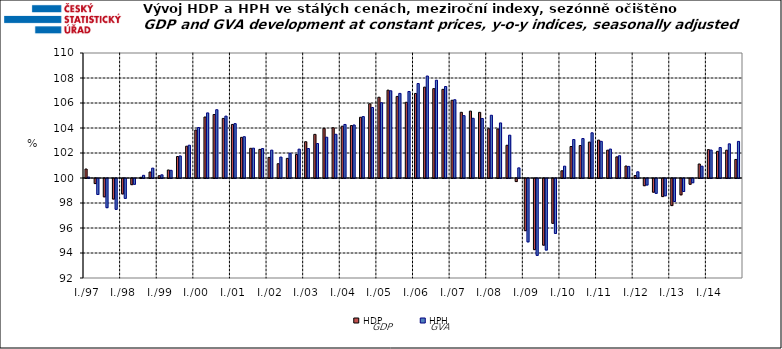
| Category | HDP

 | HPH

 |
|---|---|---|
| I./97 | 100.719 | 100.078 |
|  | 99.595 | 98.722 |
|  | 98.534 | 97.665 |
|  | 98.357 | 97.533 |
| I./98 | 98.767 | 98.409 |
|  | 99.507 | 99.536 |
|  | 100.056 | 100.215 |
|  | 100.477 | 100.79 |
| I./99 | 100.184 | 100.255 |
|  | 100.641 | 100.613 |
|  | 101.719 | 101.764 |
|  | 102.543 | 102.623 |
| I./00 | 103.839 | 104.038 |
|  | 104.879 | 105.209 |
|  | 105.081 | 105.463 |
|  | 104.766 | 104.949 |
| I./01 | 104.286 | 104.349 |
|  | 103.251 | 103.304 |
|  | 102.376 | 102.387 |
|  | 102.289 | 102.357 |
| I./02 | 101.649 | 102.23 |
|  | 101.143 | 101.673 |
|  | 101.57 | 101.981 |
|  | 101.879 | 102.308 |
| I./03 | 102.903 | 102.359 |
|  | 103.49 | 102.756 |
|  | 103.973 | 103.265 |
|  | 104.02 | 103.498 |
| I./04 | 104.144 | 104.283 |
|  | 104.194 | 104.242 |
|  | 104.858 | 104.915 |
|  | 105.936 | 105.641 |
| I./05 | 106.461 | 106.023 |
|  | 107.028 | 106.978 |
|  | 106.527 | 106.768 |
|  | 106.058 | 106.921 |
| I./06 | 106.765 | 107.557 |
|  | 107.271 | 108.159 |
|  | 107.149 | 107.824 |
|  | 107.092 | 107.32 |
| I./07 | 106.219 | 106.262 |
|  | 105.256 | 104.989 |
|  | 105.353 | 104.776 |
|  | 105.253 | 104.762 |
| I./08 | 103.944 | 105.02 |
|  | 103.926 | 104.405 |
|  | 102.618 | 103.426 |
|  | 99.755 | 100.81 |
| I./09 | 95.828 | 94.929 |
|  | 94.31 | 93.851 |
|  | 94.667 | 94.276 |
|  | 96.414 | 95.606 |
| I./10 | 100.577 | 100.947 |
|  | 102.519 | 103.079 |
|  | 102.598 | 103.157 |
|  | 102.874 | 103.616 |
| I./11 | 103.033 | 102.931 |
|  | 102.227 | 102.316 |
|  | 101.692 | 101.781 |
|  | 100.959 | 100.93 |
| I./12 | 100.2 | 100.496 |
|  | 99.425 | 99.48 |
|  | 98.904 | 98.813 |
|  | 98.554 | 98.618 |
| I./13 | 97.833 | 98.157 |
|  | 98.694 | 98.96 |
|  | 99.541 | 99.662 |
|  | 101.121 | 100.945 |
| I./14 | 102.271 | 102.236 |